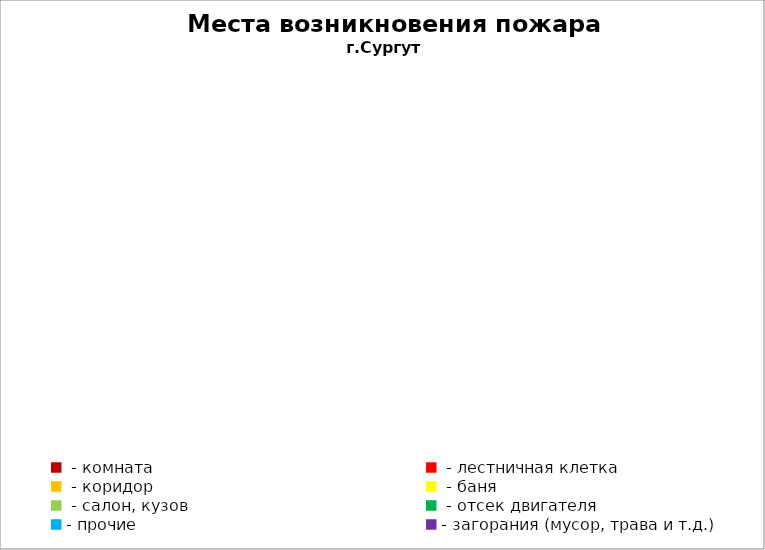
| Category | Места возникновения пожара |
|---|---|
|  - комната | 24 |
|  - лестничная клетка | 13 |
|  - коридор | 2 |
|  - баня | 13 |
|  - салон, кузов | 11 |
|  - отсек двигателя | 20 |
| - прочие | 36 |
| - загорания (мусор, трава и т.д.)  | 34 |